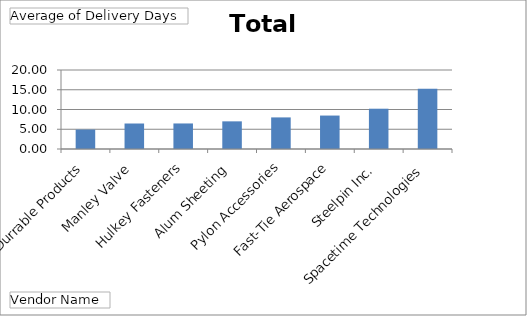
| Category | Total |
|---|---|
| Durrable Products | 4.923 |
| Manley Valve | 6.455 |
| Hulkey Fasteners | 6.467 |
| Alum Sheeting | 7 |
| Pylon Accessories | 8 |
| Fast-Tie Aerospace | 8.467 |
| Steelpin Inc. | 10.2 |
| Spacetime Technologies | 15.25 |